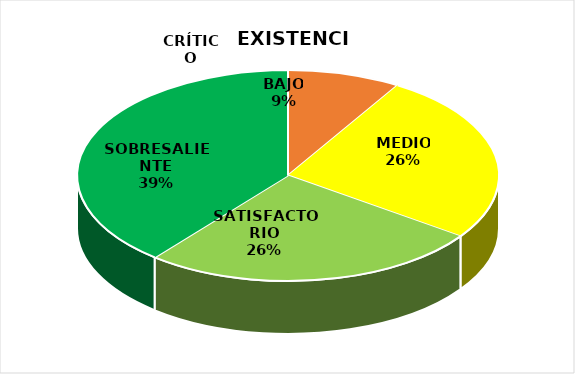
| Category | Series 1 | Series 0 |
|---|---|---|
| CRÍTICO | 0 | 2 |
| BAJO | 2 | 0 |
| MEDIO | 6 | 1 |
| SATISFACTORIO | 6 | 1 |
| SOBRESALIENTE | 9 | 52 |